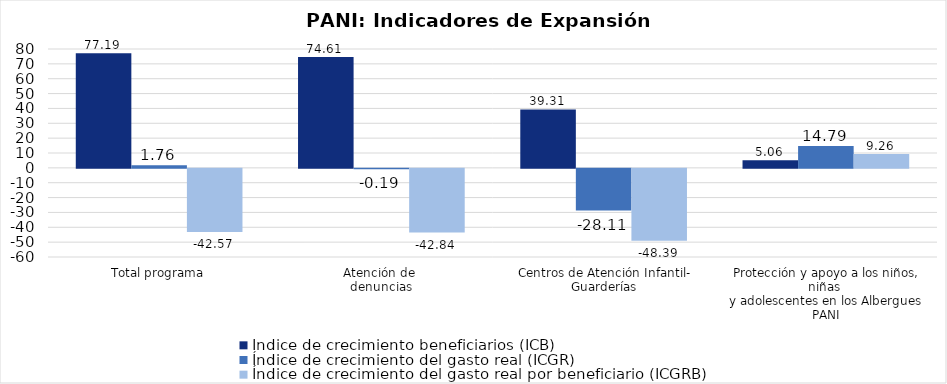
| Category | Índice de crecimiento beneficiarios (ICB)  | Índice de crecimiento del gasto real (ICGR)  | Índice de crecimiento del gasto real por beneficiario (ICGRB)  |
|---|---|---|---|
| Total programa | 77.185 | 1.76 | -42.569 |
| Atención de 
denuncias | 74.61 | -0.193 | -42.84 |
| Centros de Atención Infantil-
Guarderías | 39.312 | -28.105 | -48.393 |
| Protección y apoyo a los niños, niñas 
y adolescentes en los Albergues PANI | 5.064 | 14.794 | 9.261 |